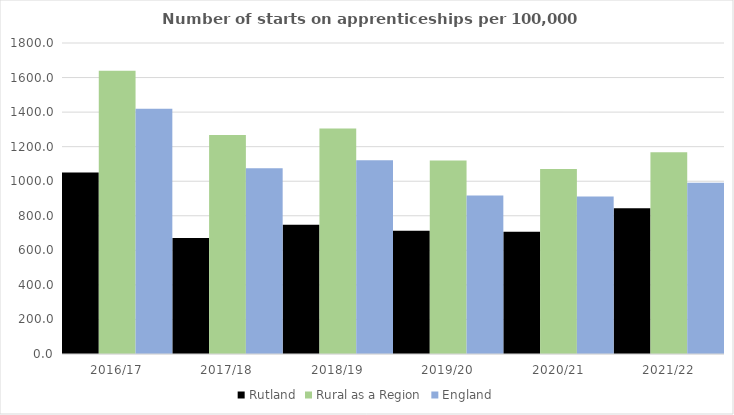
| Category | Rutland | Rural as a Region | England |
|---|---|---|---|
| 2016/17 | 1051 | 1638.789 | 1420 |
| 2017/18 | 672 | 1267.474 | 1075 |
| 2018/19 | 748 | 1304.57 | 1122 |
| 2019/20 | 713 | 1119.662 | 918 |
| 2020/21 | 708 | 1070.748 | 912 |
| 2021/22 | 844 | 1167.68 | 991 |